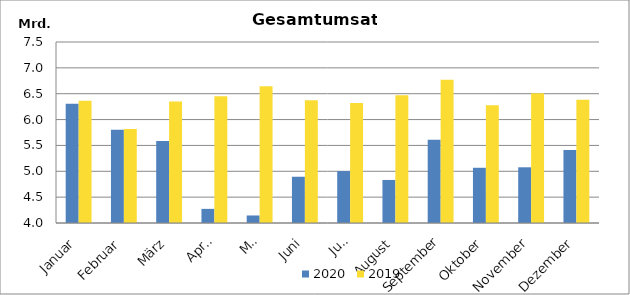
| Category | 2020 | 2019 |
|---|---|---|
| Januar | 6305554.14 | 6362224.418 |
| Februar | 5801387.251 | 5816430.53 |
| März | 5587929.782 | 6347518.835 |
| April | 4273090.497 | 6452220.173 |
| Mai | 4145602.513 | 6643916.08 |
| Juni | 4894296.121 | 6372265.859 |
| Juli | 5003915.061 | 6321949.884 |
| August | 4832500.598 | 6469972.753 |
| September | 5611608.012 | 6769842.32 |
| Oktober | 5067825.988 | 6275243.566 |
| November | 5077215.175 | 6509421.736 |
| Dezember | 5412315.667 | 6384380.012 |